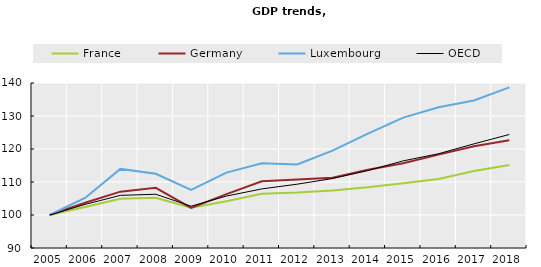
| Category | France | Germany | Luxembourg | OECD |
|---|---|---|---|---|
| 2005.0 | 100 | 100 | 100 | 100 |
| 2006.0 | 102.449 | 103.7 | 105.178 | 103.204 |
| 2007.0 | 104.933 | 107.081 | 113.966 | 105.954 |
| 2008.0 | 105.201 | 108.24 | 112.507 | 106.292 |
| 2009.0 | 102.178 | 102.158 | 107.604 | 102.663 |
| 2010.0 | 104.17 | 106.326 | 112.839 | 105.74 |
| 2011.0 | 106.454 | 110.218 | 115.704 | 107.903 |
| 2012.0 | 106.788 | 110.76 | 115.296 | 109.339 |
| 2013.0 | 107.403 | 111.302 | 119.509 | 111.052 |
| 2014.0 | 108.43 | 113.727 | 124.644 | 113.464 |
| 2015.0 | 109.637 | 115.704 | 129.525 | 116.408 |
| 2016.0 | 110.921 | 118.299 | 132.649 | 118.568 |
| 2017.0 | 113.318 | 120.851 | 134.699 | 121.562 |
| 2018.0 | 115.133 | 122.626 | 138.665 | 124.402 |